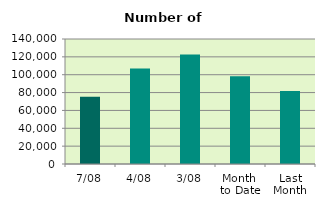
| Category | Series 0 |
|---|---|
| 7/08 | 75302 |
| 4/08 | 106976 |
| 3/08 | 122590 |
| Month 
to Date | 98322.8 |
| Last
Month | 81818 |